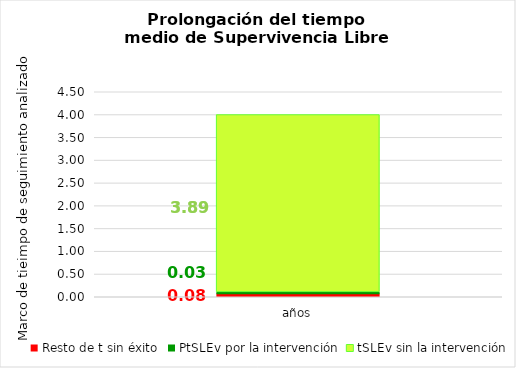
| Category | Resto de t sin éxito | PtSLEv por la intervención | tSLEv sin la intervención |
|---|---|---|---|
| años | 0.081 | 0.027 | 3.893 |